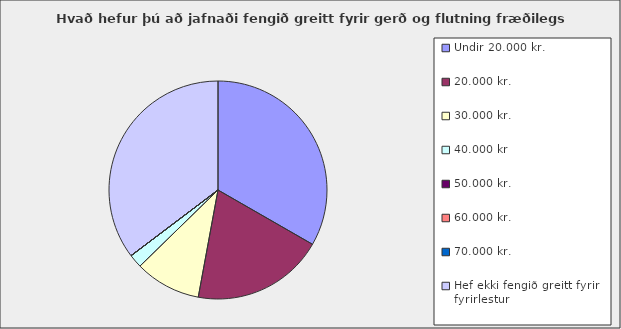
| Category | Series 0 |
|---|---|
| Undir 20.000 kr. | 0.333 |
| 20.000 kr. | 0.196 |
| 30.000 kr. | 0.098 |
| 40.000 kr | 0.02 |
| 50.000 kr. | 0 |
| 60.000 kr. | 0 |
| 70.000 kr. | 0 |
| Hef ekki fengið greitt fyrir fyrirlestur | 0.353 |